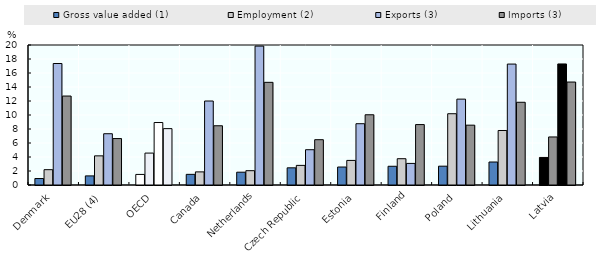
| Category | Gross value added (1) | Employment (2) | Exports (3) | Imports (3) |
|---|---|---|---|---|
| Denmark | 0.925 | 2.188 | 17.357 | 12.708 |
| EU28 (4) | 1.3 | 4.163 | 7.326 | 6.633 |
| OECD | 1.51 | 4.559 | 8.926 | 8.051 |
| Canada | 1.522 | 1.873 | 11.999 | 8.463 |
| Netherlands | 1.829 | 2.045 | 19.846 | 14.667 |
| Czech Republic | 2.453 | 2.802 | 5.04 | 6.472 |
| Estonia | 2.567 | 3.511 | 8.756 | 10.034 |
| Finland | 2.675 | 3.756 | 3.084 | 8.633 |
| Poland | 2.689 | 10.182 | 12.267 | 8.548 |
| Lithuania | 3.284 | 7.787 | 17.275 | 11.819 |
| Latvia | 3.937 | 6.862 | 17.292 | 14.708 |